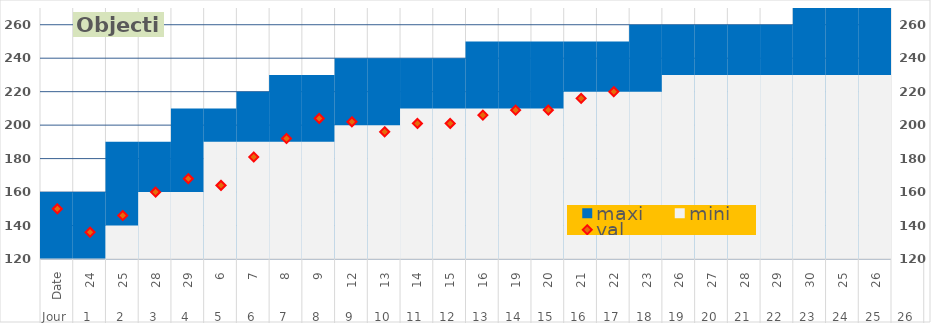
| Category | maxi | mini |
|---|---|---|
| 0 | 160 | 120 |
| 1 | 160 | 120 |
| 2 | 190 | 140 |
| 3 | 190 | 160 |
| 4 | 210 | 160 |
| 5 | 210 | 190 |
| 6 | 220 | 190 |
| 7 | 230 | 190 |
| 8 | 230 | 190 |
| 9 | 240 | 200 |
| 10 | 240 | 200 |
| 11 | 240 | 210 |
| 12 | 240 | 210 |
| 13 | 250 | 210 |
| 14 | 250 | 210 |
| 15 | 250 | 210 |
| 16 | 250 | 220 |
| 17 | 250 | 220 |
| 18 | 260 | 220 |
| 19 | 260 | 230 |
| 20 | 260 | 230 |
| 21 | 260 | 230 |
| 22 | 260 | 230 |
| 23 | 270 | 230 |
| 24 | 270 | 230 |
| 25 | 270 | 230 |